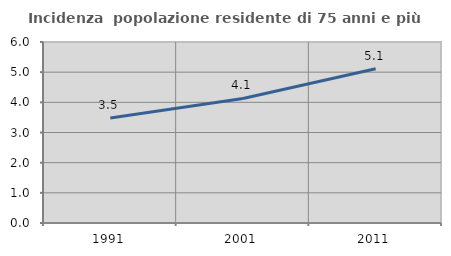
| Category | Incidenza  popolazione residente di 75 anni e più |
|---|---|
| 1991.0 | 3.479 |
| 2001.0 | 4.129 |
| 2011.0 | 5.116 |